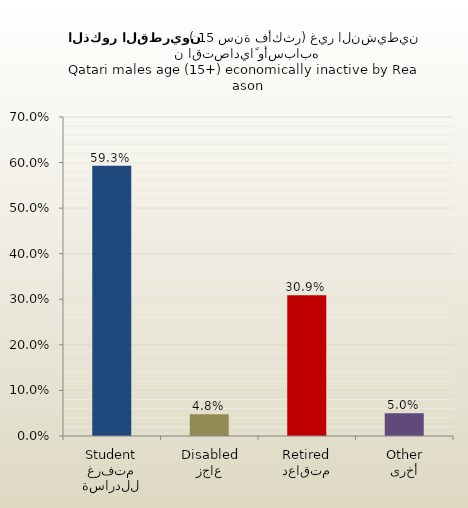
| Category | الذكور القطريين |
|---|---|
| متفرغ للدراسة
Student | 0.593 |
| عاجز
Disabled | 0.048 |
| متقاعد
Retired | 0.309 |
| أخرى
Other | 0.05 |